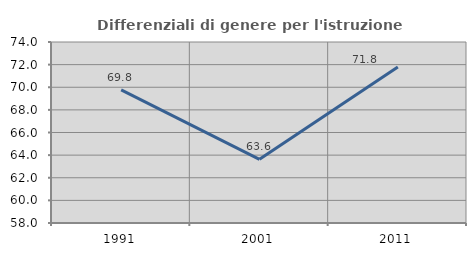
| Category | Differenziali di genere per l'istruzione superiore |
|---|---|
| 1991.0 | 69.776 |
| 2001.0 | 63.625 |
| 2011.0 | 71.799 |